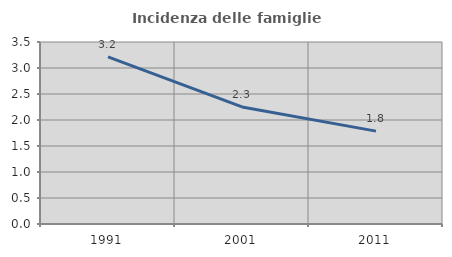
| Category | Incidenza delle famiglie numerose |
|---|---|
| 1991.0 | 3.215 |
| 2001.0 | 2.251 |
| 2011.0 | 1.786 |